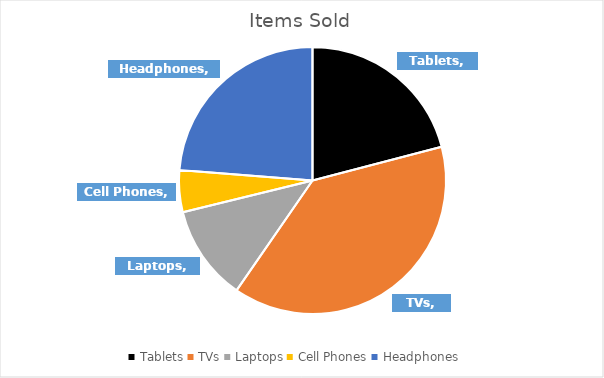
| Category | Items Sold |
|---|---|
| Tablets | 223 |
| TVs | 412 |
| Laptops | 123 |
| Cell Phones | 54 |
| Headphones | 253 |